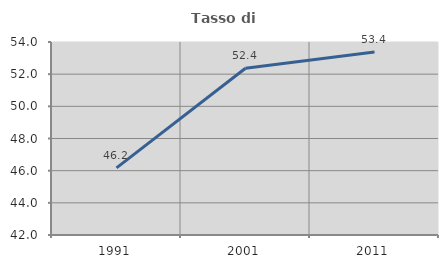
| Category | Tasso di occupazione   |
|---|---|
| 1991.0 | 46.177 |
| 2001.0 | 52.364 |
| 2011.0 | 53.372 |